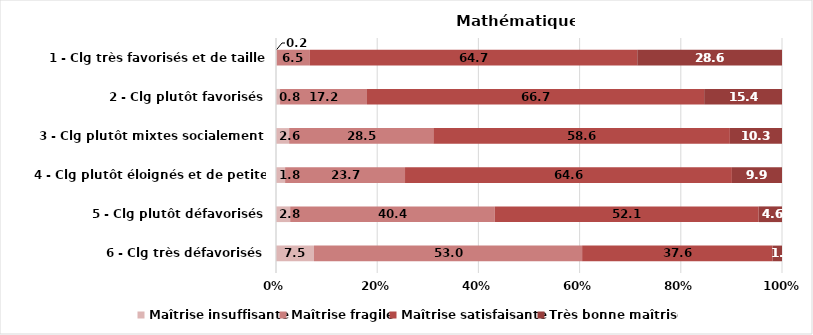
| Category | Maîtrise insuffisante | Maîtrise fragile | Maîtrise satisfaisante | Très bonne maîtrise |
|---|---|---|---|---|
| 6 - Clg très défavorisés | 7.5 | 53 | 37.6 | 1.9 |
| 5 - Clg plutôt défavorisés | 2.8 | 40.4 | 52.1 | 4.6 |
| 4 - Clg plutôt éloignés et de petite taille | 1.8 | 23.7 | 64.6 | 9.9 |
| 3 - Clg plutôt mixtes socialement | 2.6 | 28.5 | 58.6 | 10.3 |
| 2 - Clg plutôt favorisés | 0.8 | 17.2 | 66.7 | 15.4 |
| 1 - Clg très favorisés et de taille importante | 0.2 | 6.5 | 64.7 | 28.6 |